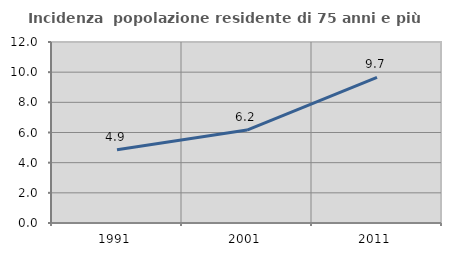
| Category | Incidenza  popolazione residente di 75 anni e più |
|---|---|
| 1991.0 | 4.855 |
| 2001.0 | 6.161 |
| 2011.0 | 9.652 |